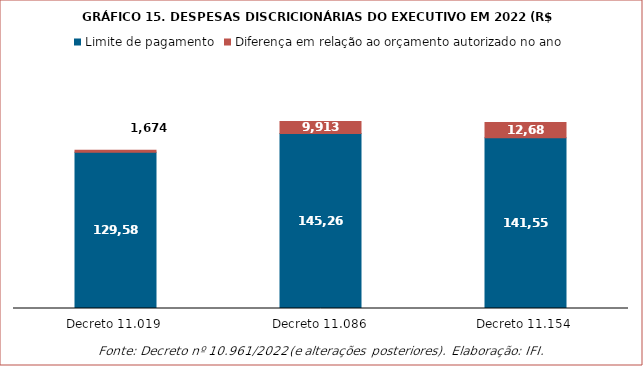
| Category | Limite de pagamento | Diferença em relação ao orçamento autorizado no ano |
|---|---|---|
| Decreto 11.019 | 129586.755 | 1674.345 |
| Decreto 11.086 | 145259.821 | 9913.279 |
| Decreto 11.154 | 141557 | 12689.2 |